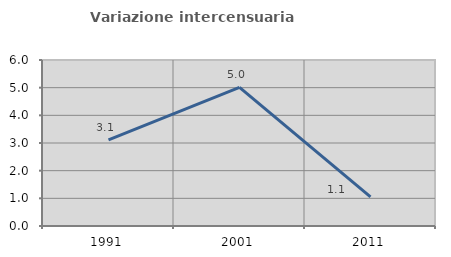
| Category | Variazione intercensuaria annua |
|---|---|
| 1991.0 | 3.115 |
| 2001.0 | 5.012 |
| 2011.0 | 1.05 |